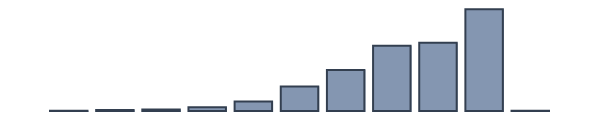
| Category | Series 0 |
|---|---|
| 0 | 0 |
| 1 | 0.1 |
| 2 | 0.3 |
| 3 | 0.5 |
| 4 | 1.2 |
| 5 | 3 |
| 6 | 7.7 |
| 7 | 12.9 |
| 8 | 20.6 |
| 9 | 21.5 |
| 10 | 32.1 |
| 11 | 0.1 |
| 12 | 0 |